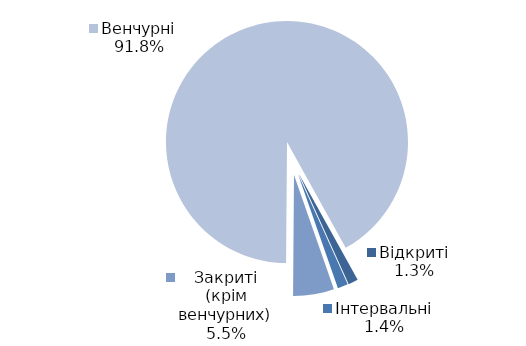
| Category | Series 0 |
|---|---|
| Відкриті | 19 |
| Інтервальні | 20 |
| Закриті (крім венчурних) | 79 |
| Венчурні | 1325 |